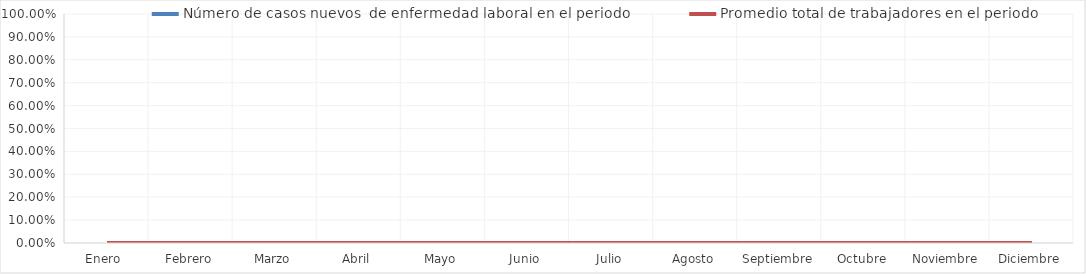
| Category | Número de casos nuevos  de enfermedad laboral en el periodo | Promedio total de trabajadores en el periodo |
|---|---|---|
| Enero  | 0 | 0 |
| Febrero | 0 | 0 |
| Marzo | 0 | 0 |
| Abril | 0 | 0 |
| Mayo | 0 | 0 |
| Junio | 0 | 0 |
| Julio | 0 | 0 |
| Agosto | 0 | 0 |
| Septiembre | 0 | 0 |
| Octubre | 0 | 0 |
| Noviembre | 0 | 0 |
| Diciembre | 0 | 0 |